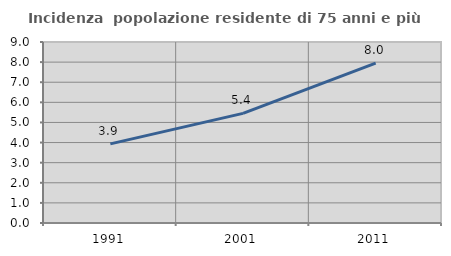
| Category | Incidenza  popolazione residente di 75 anni e più |
|---|---|
| 1991.0 | 3.936 |
| 2001.0 | 5.45 |
| 2011.0 | 7.953 |